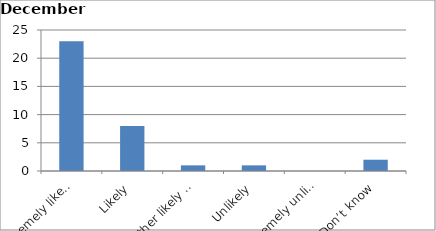
| Category | Series 0 |
|---|---|
| Extremely likely | 23 |
| Likely | 8 |
| Neither likely nor unlikely | 1 |
| Unlikely | 1 |
| Extremely unlikely | 0 |
| Don’t know | 2 |